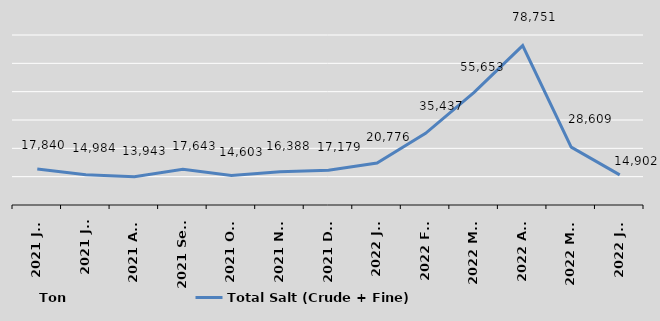
| Category | Total Salt (Crude + Fine) |
|---|---|
| 2021 Jun | 17840 |
| 2021 Jul | 14984 |
| 2021 Aug | 13943 |
| 2021 Sept | 17643 |
| 2021 Oct | 14603 |
| 2021 Nov | 16388 |
| 2021 Dec | 17179 |
| 2022 Jan | 20776 |
| 2022 Feb | 35437 |
| 2022 Mar | 55653 |
| 2022 Apr | 78751 |
| 2022 May | 28609 |
| 2022 Jun | 14902 |